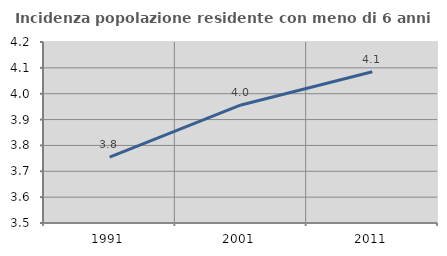
| Category | Incidenza popolazione residente con meno di 6 anni |
|---|---|
| 1991.0 | 3.755 |
| 2001.0 | 3.956 |
| 2011.0 | 4.085 |